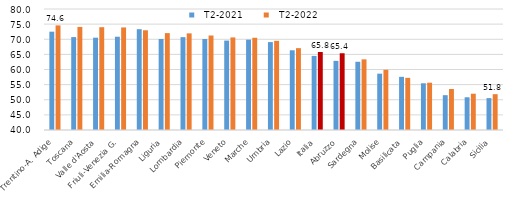
| Category |   T2-2021 |   T2-2022 |
|---|---|---|
|   Trentino-A. Adige | 72.505 | 74.577 |
|   Toscana | 70.712 | 74.072 |
|   Valle d'Aosta | 70.522 | 73.984 |
|   Friuli-Venezia G. | 70.835 | 73.902 |
|   Emilia-Romagna | 73.331 | 72.968 |
|   Liguria | 70.078 | 72.025 |
|   Lombardia | 70.7 | 71.946 |
|   Piemonte | 70.09 | 71.233 |
|   Veneto | 69.56 | 70.602 |
|   Marche | 69.87 | 70.488 |
|   Umbria | 69.062 | 69.471 |
|   Lazio | 66.356 | 67.054 |
| Italia | 64.491 | 65.795 |
|   Abruzzo | 62.862 | 65.375 |
|   Sardegna | 62.557 | 63.357 |
|   Molise | 58.624 | 59.912 |
|   Basilicata | 57.574 | 57.239 |
|   Puglia | 55.446 | 55.632 |
|   Campania | 51.514 | 53.55 |
|   Calabria | 50.821 | 51.995 |
|   Sicilia | 50.544 | 51.844 |